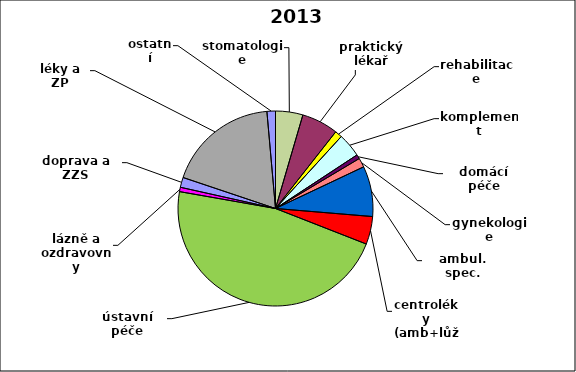
| Category | Series 0 |
|---|---|
| stomatologie | 0.045 |
| praktický lékař | 0.061 |
| rehabilitace | 0.012 |
| komplement | 0.04 |
| domácí péče | 0.007 |
| gynekologie | 0.015 |
| ambul. spec. | 0.083 |
| centroléky (amb+lůž) | 0.046 |
| ústavní péče | 0.468 |
| lázně a ozdravovny | 0.007 |
| doprava a ZZS | 0.017 |
| léky a ZP | 0.184 |
| ostatní | 0.014 |